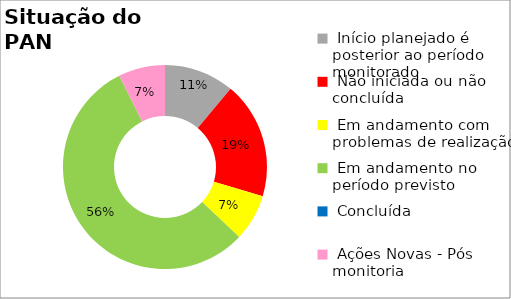
| Category | Series 0 |
|---|---|
|  Início planejado é posterior ao período monitorado | 0.111 |
|  Não iniciada ou não concluída | 0.185 |
|  Em andamento com problemas de realização | 0.074 |
|  Em andamento no período previsto  | 0.556 |
|  Concluída | 0 |
|  Ações Novas - Pós monitoria | 0.074 |